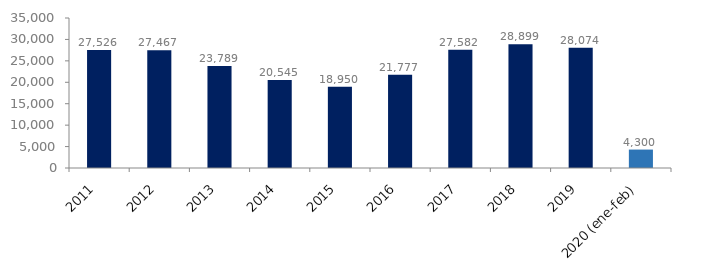
| Category | Series 1 |
|---|---|
| 2011 | 27525.675 |
| 2012 | 27466.673 |
| 2013 | 23789.445 |
| 2014 | 20545.414 |
| 2015 | 18950.14 |
| 2016 | 21776.636 |
| 2017 | 27581.607 |
| 2018 | 28898.658 |
| 2019 | 28073.793 |
| 2020 (ene-feb) | 4300.107 |